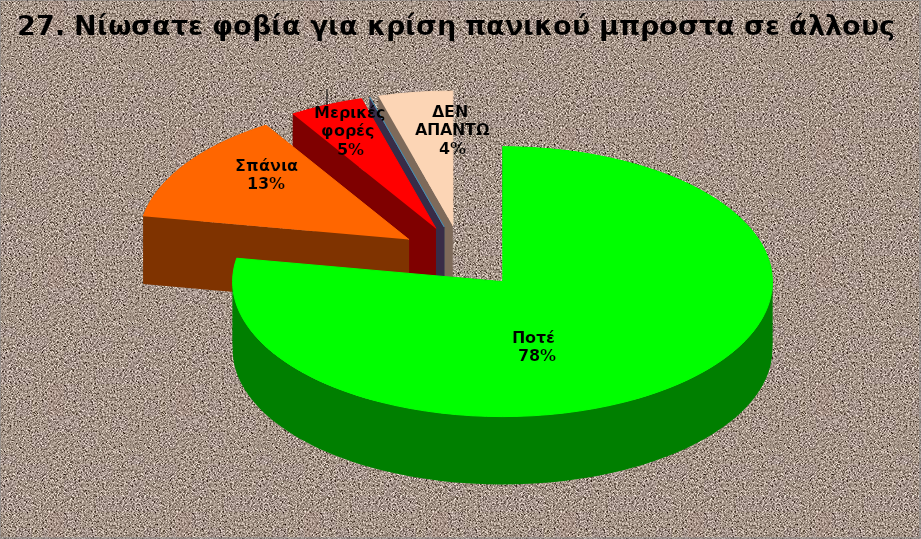
| Category | Series 0 |
|---|---|
| Ποτέ  | 35 |
| Σπάνια  | 6 |
| Μερικές φορές  | 2 |
| Συχνά  | 0 |
| Συνήθως  | 0 |
| ΔΕΝ ΑΠΑΝΤΩ | 2 |